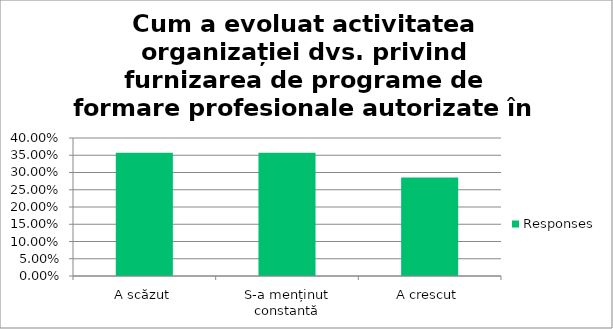
| Category | Responses |
|---|---|
| A scăzut | 0.357 |
| S-a menținut constantă | 0.357 |
| A crescut | 0.286 |